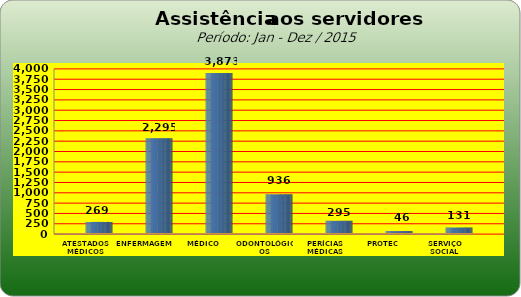
| Category | Series 0 |
|---|---|
| ATESTADOS MÉDICOS | 269 |
| ENFERMAGEM | 2295 |
| MÉDICO | 3873 |
| ODONTOLÓGICOS | 936 |
| PERÍCIAS MÉDICAS | 295 |
| PROTEC | 46 |
| SERVIÇO SOCIAL | 131 |